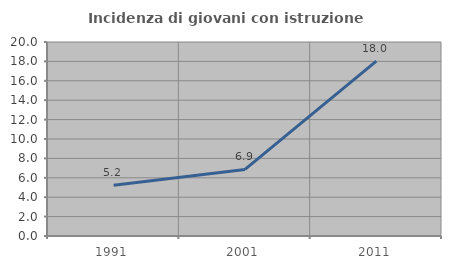
| Category | Incidenza di giovani con istruzione universitaria |
|---|---|
| 1991.0 | 5.24 |
| 2001.0 | 6.867 |
| 2011.0 | 18.033 |